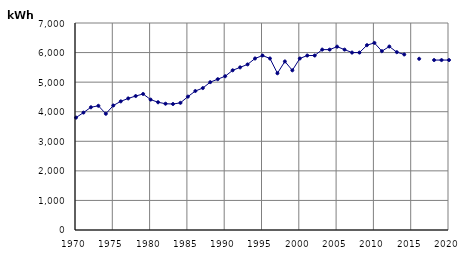
| Category | kWh |
|---|---|
| 1970.0 | 3800 |
| 1971.0 | 3970 |
| 1972.0 | 4150 |
| 1973.0 | 4200 |
| 1974.0 | 3930 |
| 1975.0 | 4210 |
| 1976.0 | 4350 |
| 1977.0 | 4450 |
| 1978.0 | 4530 |
| 1979.0 | 4600 |
| 1980.0 | 4410 |
| 1981.0 | 4320 |
| 1982.0 | 4270 |
| 1983.0 | 4260 |
| 1984.0 | 4300 |
| 1985.0 | 4510 |
| 1986.0 | 4700 |
| 1987.0 | 4800 |
| 1988.0 | 5000 |
| 1989.0 | 5100 |
| 1990.0 | 5200 |
| 1991.0 | 5400 |
| 1992.0 | 5500 |
| 1993.0 | 5600 |
| 1994.0 | 5800 |
| 1995.0 | 5900 |
| 1996.0 | 5800 |
| 1997.0 | 5300 |
| 1998.0 | 5700 |
| 1999.0 | 5400 |
| 2000.0 | 5800 |
| 2001.0 | 5900 |
| 2002.0 | 5900 |
| 2003.0 | 6100 |
| 2004.0 | 6100 |
| 2005.0 | 6200 |
| 2006.0 | 6100 |
| 2007.0 | 6000 |
| 2008.0 | 6000 |
| 2009.0 | 6249.909 |
| 2010.0 | 6326.873 |
| 2011.0 | 6047.482 |
| 2012.0 | 6204.612 |
| 2013.0 | 6014.448 |
| 2014.0 | 5935.345 |
| 2015.0 | 0 |
| 2016.0 | 5789.522 |
| 2017.0 | 0 |
| 2018.0 | 5746.621 |
| 2019.0 | 5746.621 |
| 2020.0 | 5746.621 |